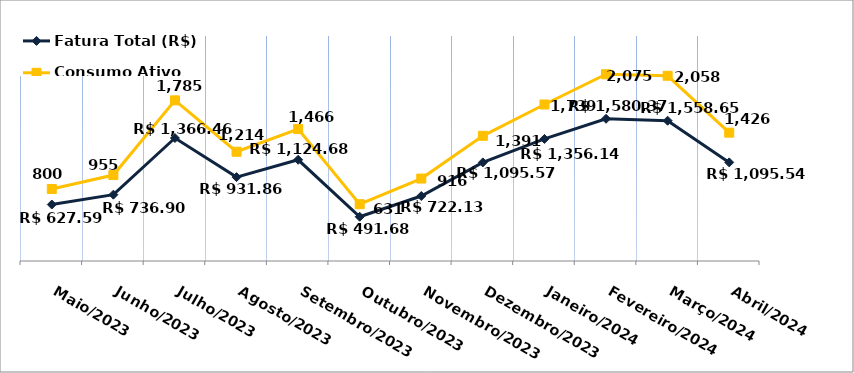
| Category | Fatura Total (R$) |
|---|---|
| Maio/2023 | 627.59 |
| Junho/2023 | 736.9 |
| Julho/2023 | 1366.46 |
| Agosto/2023 | 931.86 |
| Setembro/2023 | 1124.68 |
| Outubro/2023 | 491.68 |
| Novembro/2023 | 722.13 |
| Dezembro/2023 | 1095.57 |
| Janeiro/2024 | 1356.14 |
| Fevereiro/2024 | 1580.37 |
| Março/2024 | 1558.65 |
| Abril/2024 | 1095.54 |